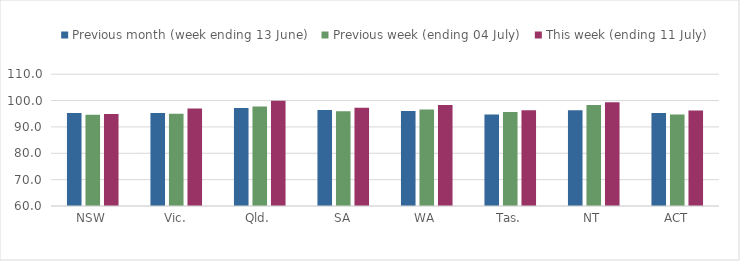
| Category | Previous month (week ending 13 June) | Previous week (ending 04 July) | This week (ending 11 July) |
|---|---|---|---|
| NSW | 95.26 | 94.593 | 94.869 |
| Vic. | 95.306 | 95.031 | 96.978 |
| Qld. | 97.151 | 97.709 | 99.966 |
| SA | 96.449 | 95.899 | 97.281 |
| WA | 96.049 | 96.608 | 98.344 |
| Tas. | 94.745 | 95.669 | 96.277 |
| NT | 96.334 | 98.348 | 99.34 |
| ACT | 95.277 | 94.746 | 96.27 |